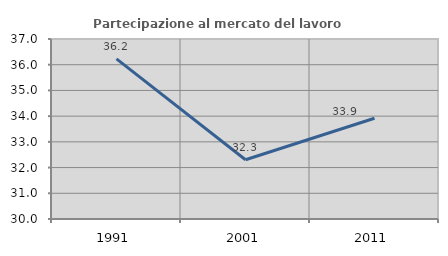
| Category | Partecipazione al mercato del lavoro  femminile |
|---|---|
| 1991.0 | 36.225 |
| 2001.0 | 32.304 |
| 2011.0 | 33.919 |